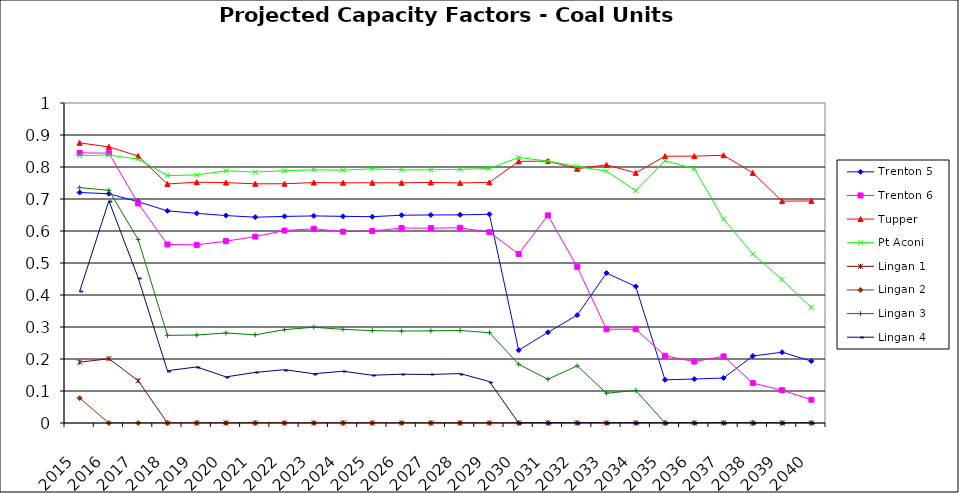
| Category | Trenton 5 | Trenton 6 | Tupper | Pt Aconi | Lingan 1 | Lingan 2 | Lingan 3 | Lingan 4 |
|---|---|---|---|---|---|---|---|---|
| 2015.0 | 0.72 | 0.844 | 0.875 | 0.836 | 0.19 | 0.078 | 0.736 | 0.411 |
| 2016.0 | 0.716 | 0.843 | 0.863 | 0.837 | 0.201 | 0 | 0.727 | 0.694 |
| 2017.0 | 0.691 | 0.686 | 0.834 | 0.825 | 0.132 | 0 | 0.573 | 0.453 |
| 2018.0 | 0.663 | 0.558 | 0.747 | 0.773 | 0 | 0 | 0.274 | 0.163 |
| 2019.0 | 0.655 | 0.557 | 0.752 | 0.775 | 0 | 0 | 0.275 | 0.175 |
| 2020.0 | 0.648 | 0.568 | 0.751 | 0.788 | 0 | 0 | 0.281 | 0.144 |
| 2021.0 | 0.643 | 0.582 | 0.747 | 0.784 | 0 | 0 | 0.276 | 0.158 |
| 2022.0 | 0.646 | 0.601 | 0.748 | 0.788 | 0 | 0 | 0.292 | 0.167 |
| 2023.0 | 0.647 | 0.607 | 0.751 | 0.791 | 0 | 0 | 0.299 | 0.154 |
| 2024.0 | 0.646 | 0.598 | 0.751 | 0.79 | 0 | 0 | 0.293 | 0.162 |
| 2025.0 | 0.645 | 0.6 | 0.751 | 0.794 | 0 | 0 | 0.289 | 0.149 |
| 2026.0 | 0.649 | 0.609 | 0.751 | 0.791 | 0 | 0 | 0.287 | 0.153 |
| 2027.0 | 0.65 | 0.609 | 0.752 | 0.791 | 0 | 0 | 0.288 | 0.152 |
| 2028.0 | 0.65 | 0.61 | 0.75 | 0.793 | 0 | 0 | 0.289 | 0.154 |
| 2029.0 | 0.652 | 0.596 | 0.752 | 0.795 | 0 | 0 | 0.282 | 0.13 |
| 2030.0 | 0.227 | 0.528 | 0.817 | 0.83 | 0 | 0 | 0.183 | 0 |
| 2031.0 | 0.283 | 0.649 | 0.818 | 0.818 | 0 | 0 | 0.137 | 0 |
| 2032.0 | 0.337 | 0.488 | 0.794 | 0.802 | 0 | 0 | 0.179 | 0 |
| 2033.0 | 0.469 | 0.293 | 0.807 | 0.787 | 0 | 0 | 0.093 | 0 |
| 2034.0 | 0.427 | 0.293 | 0.782 | 0.726 | 0 | 0 | 0.102 | 0 |
| 2035.0 | 0.135 | 0.21 | 0.834 | 0.819 | 0 | 0 | 0 | 0 |
| 2036.0 | 0.137 | 0.192 | 0.834 | 0.795 | 0 | 0 | 0 | 0 |
| 2037.0 | 0.141 | 0.208 | 0.837 | 0.637 | 0 | 0 | 0 | 0 |
| 2038.0 | 0.209 | 0.125 | 0.782 | 0.528 | 0 | 0 | 0 | 0 |
| 2039.0 | 0.221 | 0.102 | 0.693 | 0.448 | 0 | 0 | 0 | 0 |
| 2040.0 | 0.193 | 0.073 | 0.694 | 0.361 | 0 | 0 | 0 | 0 |